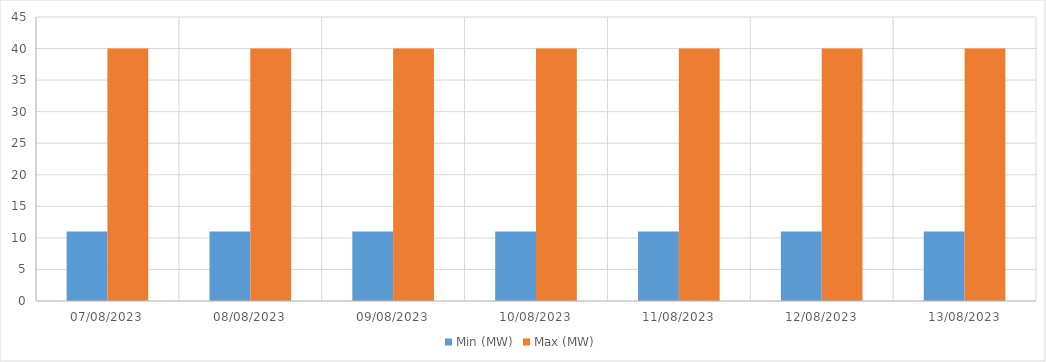
| Category | Min (MW) | Max (MW) |
|---|---|---|
| 07/08/2023 | 11 | 40 |
| 08/08/2023 | 11 | 40 |
| 09/08/2023 | 11 | 40 |
| 10/08/2023 | 11 | 40 |
| 11/08/2023 | 11 | 40 |
| 12/08/2023 | 11 | 40 |
| 13/08/2023 | 11 | 40 |